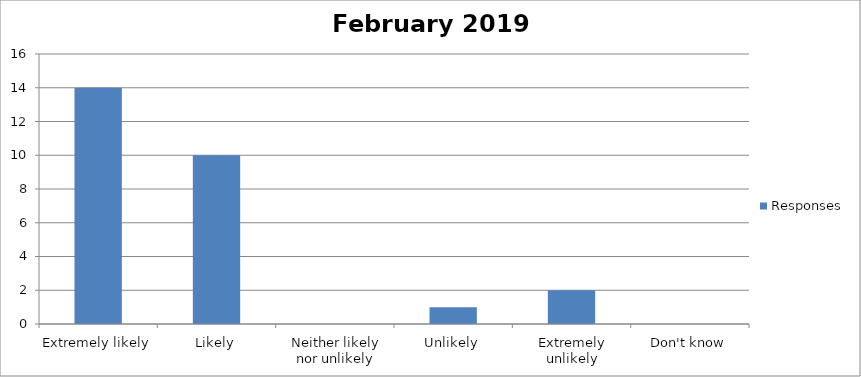
| Category | Responses |
|---|---|
| Extremely likely | 14 |
| Likely | 10 |
| Neither likely nor unlikely | 0 |
| Unlikely | 1 |
| Extremely unlikely | 2 |
| Don't know | 0 |